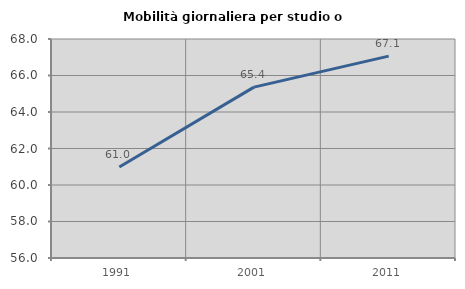
| Category | Mobilità giornaliera per studio o lavoro |
|---|---|
| 1991.0 | 60.985 |
| 2001.0 | 65.361 |
| 2011.0 | 67.06 |